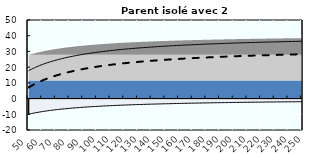
| Category | Coin fiscal moyen (somme des composantes) | Taux moyen d'imposition net en % du salaire brut |
|---|---|---|
| 50.0 | 17.791 | 7.104 |
| 51.0 | 18.249 | 7.621 |
| 52.0 | 18.689 | 8.119 |
| 53.0 | 19.113 | 8.598 |
| 54.0 | 19.521 | 9.059 |
| 55.0 | 19.915 | 9.504 |
| 56.0 | 20.294 | 9.932 |
| 57.0 | 20.66 | 10.346 |
| 58.0 | 21.013 | 10.745 |
| 59.0 | 21.354 | 11.13 |
| 60.0 | 21.684 | 11.503 |
| 61.0 | 22.003 | 11.864 |
| 62.0 | 22.312 | 12.213 |
| 63.0 | 22.611 | 12.551 |
| 64.0 | 22.901 | 12.878 |
| 65.0 | 23.182 | 13.195 |
| 66.0 | 23.454 | 13.503 |
| 67.0 | 23.718 | 13.801 |
| 68.0 | 23.974 | 14.091 |
| 69.0 | 24.223 | 14.372 |
| 70.0 | 24.465 | 14.646 |
| 71.0 | 24.7 | 14.911 |
| 72.0 | 24.929 | 15.169 |
| 73.0 | 25.151 | 15.42 |
| 74.0 | 25.367 | 15.665 |
| 75.0 | 25.578 | 15.903 |
| 76.0 | 25.782 | 16.134 |
| 77.0 | 25.982 | 16.36 |
| 78.0 | 26.176 | 16.579 |
| 79.0 | 26.366 | 16.794 |
| 80.0 | 26.551 | 17.002 |
| 81.0 | 26.731 | 17.206 |
| 82.0 | 26.907 | 17.405 |
| 83.0 | 27.079 | 17.599 |
| 84.0 | 27.246 | 17.788 |
| 85.0 | 27.41 | 17.973 |
| 86.0 | 27.569 | 18.153 |
| 87.0 | 27.725 | 18.33 |
| 88.0 | 27.878 | 18.502 |
| 89.0 | 28.027 | 18.671 |
| 90.0 | 28.173 | 18.835 |
| 91.0 | 28.316 | 18.997 |
| 92.0 | 28.455 | 19.154 |
| 93.0 | 28.592 | 19.309 |
| 94.0 | 28.725 | 19.46 |
| 95.0 | 28.856 | 19.607 |
| 96.0 | 28.984 | 19.752 |
| 97.0 | 29.11 | 19.894 |
| 98.0 | 29.232 | 20.033 |
| 99.0 | 29.353 | 20.169 |
| 100.0 | 29.471 | 20.302 |
| 101.0 | 29.586 | 20.433 |
| 102.0 | 29.7 | 20.561 |
| 103.0 | 29.811 | 20.686 |
| 104.0 | 29.92 | 20.81 |
| 105.0 | 30.027 | 20.93 |
| 106.0 | 30.132 | 21.049 |
| 107.0 | 30.235 | 21.165 |
| 108.0 | 30.336 | 21.28 |
| 109.0 | 30.435 | 21.392 |
| 110.0 | 30.533 | 21.502 |
| 111.0 | 30.628 | 21.61 |
| 112.0 | 30.722 | 21.716 |
| 113.0 | 30.814 | 21.82 |
| 114.0 | 30.905 | 21.923 |
| 115.0 | 30.994 | 22.023 |
| 116.0 | 31.082 | 22.122 |
| 117.0 | 31.168 | 22.22 |
| 118.0 | 31.252 | 22.315 |
| 119.0 | 31.336 | 22.409 |
| 120.0 | 31.417 | 22.502 |
| 121.0 | 31.498 | 22.593 |
| 122.0 | 31.577 | 22.682 |
| 123.0 | 31.655 | 22.77 |
| 124.0 | 31.731 | 22.856 |
| 125.0 | 31.807 | 22.942 |
| 126.0 | 31.881 | 23.025 |
| 127.0 | 31.954 | 23.108 |
| 128.0 | 32.026 | 23.189 |
| 129.0 | 32.096 | 23.269 |
| 130.0 | 32.166 | 23.348 |
| 131.0 | 32.235 | 23.425 |
| 132.0 | 32.302 | 23.501 |
| 133.0 | 32.369 | 23.577 |
| 134.0 | 32.434 | 23.651 |
| 135.0 | 32.499 | 23.724 |
| 136.0 | 32.562 | 23.796 |
| 137.0 | 32.625 | 23.866 |
| 138.0 | 32.687 | 23.936 |
| 139.0 | 32.748 | 24.005 |
| 140.0 | 32.808 | 24.073 |
| 141.0 | 32.867 | 24.14 |
| 142.0 | 32.925 | 24.206 |
| 143.0 | 32.983 | 24.271 |
| 144.0 | 33.04 | 24.335 |
| 145.0 | 33.095 | 24.398 |
| 146.0 | 33.151 | 24.46 |
| 147.0 | 33.205 | 24.522 |
| 148.0 | 33.259 | 24.582 |
| 149.0 | 33.312 | 24.642 |
| 150.0 | 33.364 | 24.701 |
| 151.0 | 33.416 | 24.76 |
| 152.0 | 33.466 | 24.817 |
| 153.0 | 33.517 | 24.874 |
| 154.0 | 33.566 | 24.93 |
| 155.0 | 33.615 | 24.985 |
| 156.0 | 33.663 | 25.04 |
| 157.0 | 33.711 | 25.094 |
| 158.0 | 33.758 | 25.147 |
| 159.0 | 33.805 | 25.199 |
| 160.0 | 33.851 | 25.251 |
| 161.0 | 33.896 | 25.302 |
| 162.0 | 33.941 | 25.353 |
| 163.0 | 33.985 | 25.403 |
| 164.0 | 34.029 | 25.452 |
| 165.0 | 34.072 | 25.501 |
| 166.0 | 34.114 | 25.549 |
| 167.0 | 34.157 | 25.597 |
| 168.0 | 34.198 | 25.644 |
| 169.0 | 34.239 | 25.69 |
| 170.0 | 34.28 | 25.736 |
| 171.0 | 34.32 | 25.782 |
| 172.0 | 34.36 | 25.827 |
| 173.0 | 34.399 | 25.871 |
| 174.0 | 34.438 | 25.915 |
| 175.0 | 34.476 | 25.958 |
| 176.0 | 34.514 | 26.001 |
| 177.0 | 34.552 | 26.043 |
| 178.0 | 34.589 | 26.085 |
| 179.0 | 34.625 | 26.127 |
| 180.0 | 34.662 | 26.168 |
| 181.0 | 34.698 | 26.208 |
| 182.0 | 34.733 | 26.248 |
| 183.0 | 34.768 | 26.288 |
| 184.0 | 34.803 | 26.327 |
| 185.0 | 34.837 | 26.366 |
| 186.0 | 34.871 | 26.404 |
| 187.0 | 34.905 | 26.442 |
| 188.0 | 34.938 | 26.48 |
| 189.0 | 34.971 | 26.517 |
| 190.0 | 35.003 | 26.554 |
| 191.0 | 35.035 | 26.59 |
| 192.0 | 35.067 | 26.626 |
| 193.0 | 35.099 | 26.662 |
| 194.0 | 35.13 | 26.697 |
| 195.0 | 35.161 | 26.732 |
| 196.0 | 35.191 | 26.766 |
| 197.0 | 35.222 | 26.8 |
| 198.0 | 35.252 | 26.834 |
| 199.0 | 35.281 | 26.868 |
| 200.0 | 35.311 | 26.901 |
| 201.0 | 35.34 | 26.934 |
| 202.0 | 35.368 | 26.966 |
| 203.0 | 35.397 | 26.998 |
| 204.0 | 35.425 | 27.03 |
| 205.0 | 35.453 | 27.062 |
| 206.0 | 35.481 | 27.093 |
| 207.0 | 35.508 | 27.124 |
| 208.0 | 35.535 | 27.155 |
| 209.0 | 35.562 | 27.185 |
| 210.0 | 35.589 | 27.215 |
| 211.0 | 35.615 | 27.245 |
| 212.0 | 35.641 | 27.274 |
| 213.0 | 35.667 | 27.304 |
| 214.0 | 35.693 | 27.333 |
| 215.0 | 35.718 | 27.361 |
| 216.0 | 35.743 | 27.39 |
| 217.0 | 35.768 | 27.418 |
| 218.0 | 35.793 | 27.446 |
| 219.0 | 35.817 | 27.473 |
| 220.0 | 35.841 | 27.501 |
| 221.0 | 35.866 | 27.528 |
| 222.0 | 35.889 | 27.555 |
| 223.0 | 35.913 | 27.582 |
| 224.0 | 35.936 | 27.608 |
| 225.0 | 35.959 | 27.634 |
| 226.0 | 35.982 | 27.66 |
| 227.0 | 36.005 | 27.686 |
| 228.0 | 36.028 | 27.711 |
| 229.0 | 36.05 | 27.737 |
| 230.0 | 36.072 | 27.762 |
| 231.0 | 36.094 | 27.787 |
| 232.0 | 36.116 | 27.811 |
| 233.0 | 36.138 | 27.836 |
| 234.0 | 36.159 | 27.86 |
| 235.0 | 36.18 | 27.884 |
| 236.0 | 36.201 | 27.908 |
| 237.0 | 36.222 | 27.931 |
| 238.0 | 36.243 | 27.955 |
| 239.0 | 36.264 | 27.978 |
| 240.0 | 36.284 | 28.001 |
| 241.0 | 36.304 | 28.024 |
| 242.0 | 36.324 | 28.046 |
| 243.0 | 36.344 | 28.069 |
| 244.0 | 36.364 | 28.091 |
| 245.0 | 36.383 | 28.113 |
| 246.0 | 36.403 | 28.135 |
| 247.0 | 36.422 | 28.157 |
| 248.0 | 36.441 | 28.178 |
| 249.0 | 36.46 | 28.2 |
| 250.0 | 36.479 | 28.221 |